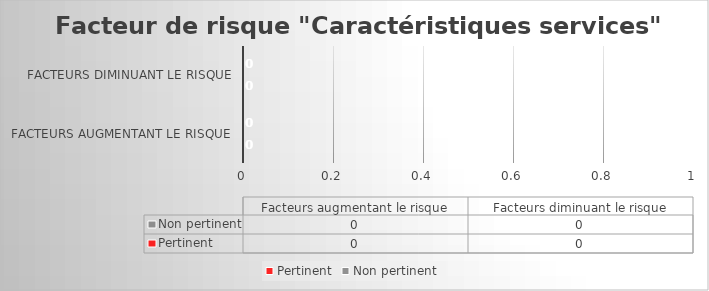
| Category | Pertinent | Non pertinent |
|---|---|---|
| Facteurs augmentant le risque | 0 | 0 |
| Facteurs diminuant le risque | 0 | 0 |